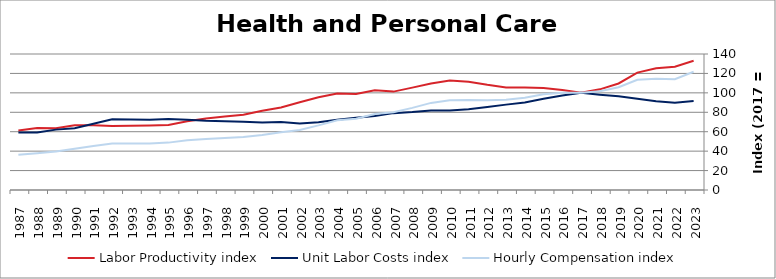
| Category | Labor Productivity index | Unit Labor Costs index | Hourly Compensation index |
|---|---|---|---|
| 2023.0 | 132.975 | 91.514 | 121.691 |
| 2022.0 | 126.969 | 89.764 | 113.972 |
| 2021.0 | 125.33 | 91.383 | 114.53 |
| 2020.0 | 120.862 | 93.928 | 113.524 |
| 2019.0 | 109.646 | 96.464 | 105.769 |
| 2018.0 | 103.617 | 98.085 | 101.632 |
| 2017.0 | 100 | 100 | 100 |
| 2016.0 | 102.948 | 97.258 | 100.125 |
| 2015.0 | 104.943 | 93.909 | 98.551 |
| 2014.0 | 105.481 | 90.124 | 95.063 |
| 2013.0 | 105.638 | 87.881 | 92.836 |
| 2012.0 | 108.261 | 85.455 | 92.514 |
| 2011.0 | 111.439 | 83.179 | 92.694 |
| 2010.0 | 112.825 | 81.882 | 92.383 |
| 2009.0 | 109.661 | 81.764 | 89.663 |
| 2008.0 | 105.375 | 80.206 | 84.517 |
| 2007.0 | 101.282 | 79.13 | 80.145 |
| 2006.0 | 102.656 | 76.177 | 78.2 |
| 2005.0 | 98.892 | 74.254 | 73.431 |
| 2004.0 | 99.36 | 72.249 | 71.787 |
| 2003.0 | 95.381 | 69.73 | 66.509 |
| 2002.0 | 90.339 | 68.444 | 61.832 |
| 2001.0 | 85 | 70.033 | 59.529 |
| 2000.0 | 81.522 | 69.578 | 56.721 |
| 1999.0 | 77.548 | 70.326 | 54.536 |
| 1998.0 | 75.614 | 70.793 | 53.529 |
| 1997.0 | 73.714 | 71.167 | 52.46 |
| 1996.0 | 70.784 | 72.362 | 51.22 |
| 1995.0 | 66.831 | 72.977 | 48.771 |
| 1994.0 | 66.313 | 72.354 | 47.98 |
| 1993.0 | 66.115 | 72.45 | 47.9 |
| 1992.0 | 65.785 | 72.728 | 47.844 |
| 1991.0 | 66.544 | 68.165 | 45.36 |
| 1990.0 | 66.708 | 63.576 | 42.41 |
| 1989.0 | 63.608 | 62.153 | 39.534 |
| 1988.0 | 63.755 | 59.315 | 37.816 |
| 1987.0 | 61.256 | 59.077 | 36.188 |